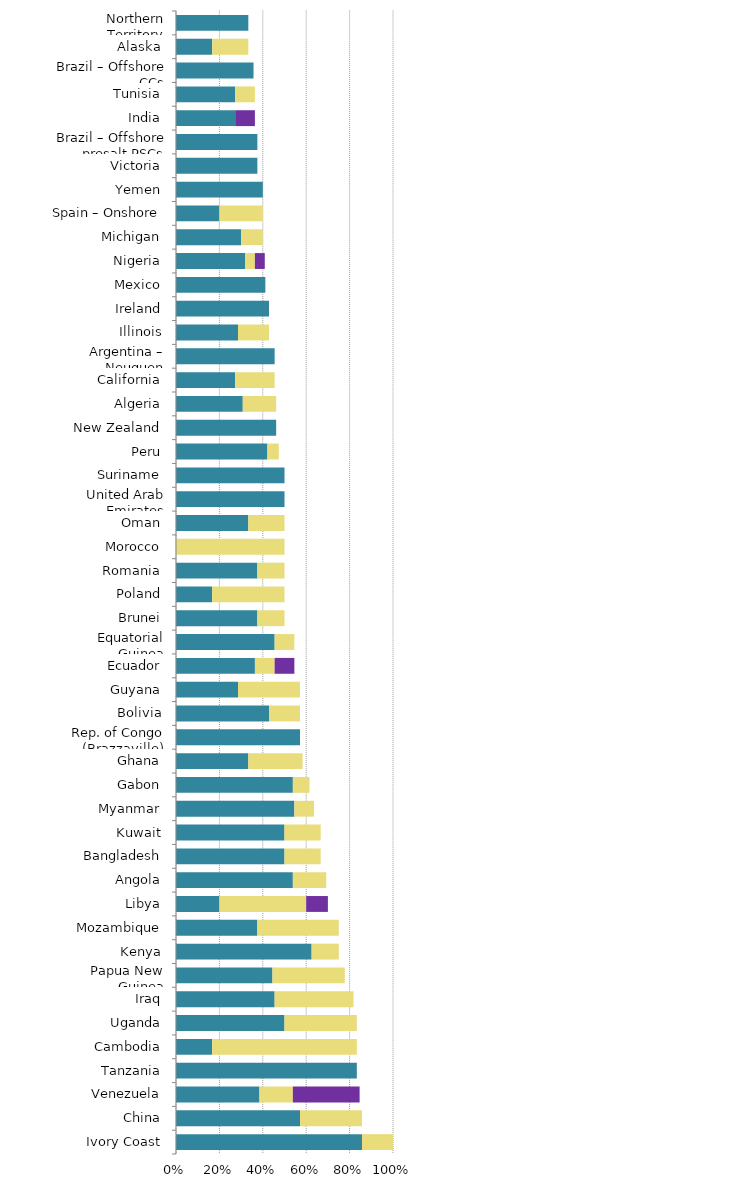
| Category | Mild deterrent to investment | Strong deterrent to investment | Would not pursue investment due to this factor |
|---|---|---|---|
| Ivory Coast | 0.857 | 0.143 | 0 |
| China | 0.571 | 0.286 | 0 |
| Venezuela | 0.385 | 0.154 | 0.308 |
| Tanzania | 0.833 | 0 | 0 |
| Cambodia | 0.167 | 0.667 | 0 |
| Uganda | 0.5 | 0.333 | 0 |
| Iraq | 0.455 | 0.364 | 0 |
| Papua New Guinea | 0.444 | 0.333 | 0 |
| Kenya | 0.625 | 0.125 | 0 |
| Mozambique | 0.375 | 0.375 | 0 |
| Libya | 0.2 | 0.4 | 0.1 |
| Angola | 0.538 | 0.154 | 0 |
| Bangladesh | 0.5 | 0.167 | 0 |
| Kuwait | 0.5 | 0.167 | 0 |
| Myanmar | 0.545 | 0.091 | 0 |
| Gabon | 0.538 | 0.077 | 0 |
| Ghana | 0.333 | 0.25 | 0 |
| Rep. of Congo (Brazzaville) | 0.571 | 0 | 0 |
| Bolivia | 0.429 | 0.143 | 0 |
| Guyana | 0.286 | 0.286 | 0 |
| Ecuador | 0.364 | 0.091 | 0.091 |
| Equatorial Guinea | 0.455 | 0.091 | 0 |
| Brunei | 0.375 | 0.125 | 0 |
| Poland | 0.167 | 0.333 | 0 |
| Romania | 0.375 | 0.125 | 0 |
| Morocco | 0 | 0.5 | 0 |
| Oman | 0.333 | 0.167 | 0 |
| United Arab Emirates | 0.5 | 0 | 0 |
| Suriname | 0.5 | 0 | 0 |
| Peru | 0.421 | 0.053 | 0 |
| New Zealand | 0.462 | 0 | 0 |
| Algeria | 0.308 | 0.154 | 0 |
| California | 0.273 | 0.182 | 0 |
| Argentina – Neuquen | 0.455 | 0 | 0 |
| Illinois | 0.286 | 0.143 | 0 |
| Ireland | 0.429 | 0 | 0 |
| Mexico | 0.412 | 0 | 0 |
| Nigeria | 0.318 | 0.045 | 0.045 |
| Michigan | 0.3 | 0.1 | 0 |
| Spain – Onshore | 0.2 | 0.2 | 0 |
| Yemen | 0.4 | 0 | 0 |
| Victoria | 0.375 | 0 | 0 |
| Brazil – Offshore presalt PSCs | 0.375 | 0 | 0 |
| India | 0.273 | 0 | 0.091 |
| Tunisia | 0.273 | 0.091 | 0 |
| Brazil – Offshore CCs | 0.357 | 0 | 0 |
| Alaska | 0.167 | 0.167 | 0 |
| Northern Territory | 0.333 | 0 | 0 |